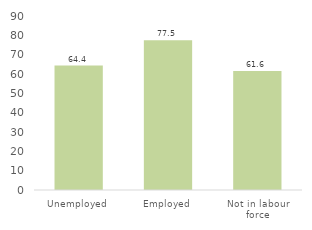
| Category | Series 0 |
|---|---|
| Unemployed | 64.37 |
| Employed | 77.508 |
| Not in labour force | 61.57 |